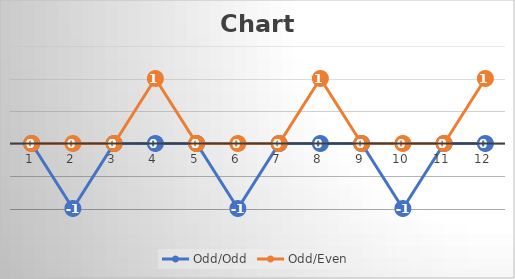
| Category | Odd/Odd | Odd/Even |
|---|---|---|
| 0 | 0 | 0 |
| 1 | -1 | 0 |
| 2 | 0 | 0 |
| 3 | 0 | 1 |
| 4 | 0 | 0 |
| 5 | -1 | 0 |
| 6 | 0 | 0 |
| 7 | 0 | 1 |
| 8 | 0 | 0 |
| 9 | -1 | 0 |
| 10 | 0 | 0 |
| 11 | 0 | 1 |